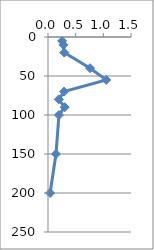
| Category | Series 0 |
|---|---|
| 0.25500730593607307 | 5 |
| 0.2796430963252881 | 10 |
| 0.29532041748206134 | 20 |
| 0.7611608175690369 | 40 |
| 1.0523110676233964 | 55 |
| 0.2908411828658404 | 70 |
| 0.19588140900195694 | 80 |
| 0.3020392694063927 | 90 |
| 0.19789706457925638 | 100 |
| 0.14437021091541638 | 150 |
| 0.037764427049358555 | 200 |